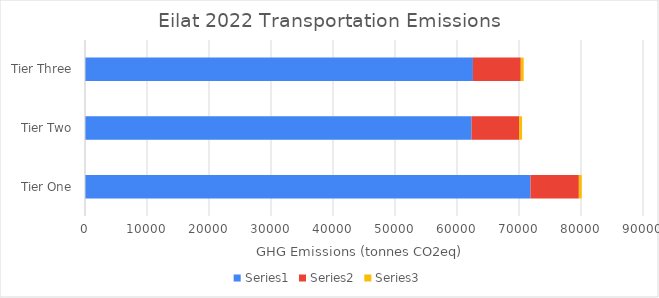
| Category | Series 0 | Series 1 | Series 2 |
|---|---|---|---|
| Tier One | 71848.232 | 7803.703 | 466.793 |
| Tier Two | 62351.7 | 7676.179 | 466.829 |
| Tier Three | 62569.964 | 7717.314 | 469.616 |